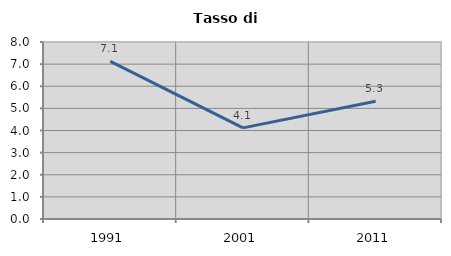
| Category | Tasso di disoccupazione   |
|---|---|
| 1991.0 | 7.123 |
| 2001.0 | 4.119 |
| 2011.0 | 5.323 |